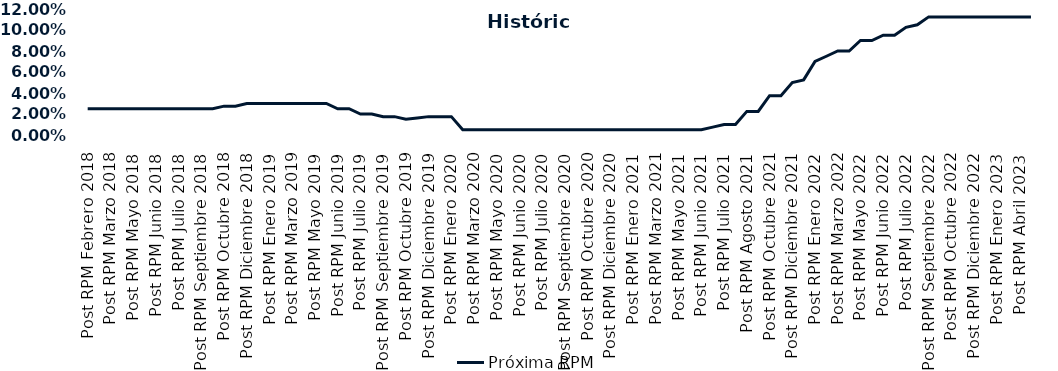
| Category | Próxima RPM |
|---|---|
| Post RPM Febrero 2018 | 0.025 |
| Pre RPM Marzo 2018 | 0.025 |
| Post RPM Marzo 2018 | 0.025 |
| Pre RPM Mayo 2018 | 0.025 |
| Post RPM Mayo 2018 | 0.025 |
| Pre RPM Junio 2018 | 0.025 |
| Post RPM Junio 2018 | 0.025 |
| Pre RPM Julio 2018 | 0.025 |
| Post RPM Julio 2018 | 0.025 |
| Pre RPM Septiembre 2018 | 0.025 |
| Post RPM Septiembre 2018 | 0.025 |
| Pre RPM Octubre 2018 | 0.025 |
| Post RPM Octubre 2018 | 0.028 |
| Pre RPM Diciembre 2018 | 0.028 |
| Post RPM Diciembre 2018 | 0.03 |
| Pre RPM Enero 2019 | 0.03 |
| Post RPM Enero 2019 | 0.03 |
| Pre RPM Marzo 2019 | 0.03 |
| Post RPM Marzo 2019 | 0.03 |
| Pre RPM Mayo 2019 | 0.03 |
| Post RPM Mayo 2019 | 0.03 |
| Pre RPM Junio 2019 | 0.03 |
| Post RPM Junio 2019 | 0.025 |
| Pre RPM Julio 2019 | 0.025 |
| Post RPM Julio 2019 | 0.02 |
| Pre RPM Septiembre 2019 | 0.02 |
| Post RPM Septiembre 2019 | 0.018 |
| Pre RPM Octubre 2019 | 0.018 |
| Post RPM Octubre 2019 | 0.015 |
| Pre RPM Diciembre 2019 | 0.016 |
| Post RPM Diciembre 2019 | 0.018 |
| Pre RPM Enero 2020 | 0.018 |
| Post RPM Enero 2020 | 0.018 |
| Pre RPM Marzo 2020 | 0.005 |
| Post RPM Marzo 2020 | 0.005 |
| Pre RPM Mayo 2020 | 0.005 |
| Post RPM Mayo 2020 | 0.005 |
| Pre RPM Junio 2020 | 0.005 |
| Post RPM Junio 2020 | 0.005 |
| Pre RPM Julio 2020 | 0.005 |
| Post RPM Julio 2020 | 0.005 |
| Pre RPM Septiembre 2020 | 0.005 |
| Post RPM Septiembre 2020 | 0.005 |
| Pre RPM Octubre 2020 | 0.005 |
| Post RPM Octubre 2020 | 0.005 |
| Pre RPM Diciembre 2020 | 0.005 |
| Post RPM Diciembre 2020 | 0.005 |
| Pre RPM Enero 2021 | 0.005 |
| Post RPM Enero 2021 | 0.005 |
| Pre RPM Marzo 2021 | 0.005 |
| Post RPM Marzo 2021 | 0.005 |
| Pre RPM Mayo 2021 | 0.005 |
| Post RPM Mayo 2021 | 0.005 |
| Pre RPM Junio 2021 | 0.005 |
| Post RPM Junio 2021 | 0.005 |
| Pre RPM Julio 2021 | 0.008 |
| Post RPM Julio 2021 | 0.01 |
| Pre RPM Agosto 2021 | 0.01 |
| Post RPM Agosto 2021 | 0.022 |
| Pre RPM Octubre 2021 | 0.022 |
| Post RPM Octubre 2021 | 0.038 |
| Pre RPM Diciembre 2021 | 0.038 |
| Post RPM Diciembre 2021 | 0.05 |
| Pre RPM Enero 2022 | 0.052 |
| Post RPM Enero 2022 | 0.07 |
| Pre RPM Marzo 2022 | 0.075 |
| Post RPM Marzo 2022 | 0.08 |
| Pre RPM Mayo 2022 | 0.08 |
| Post RPM Mayo 2022 | 0.09 |
| Pre RPM Junio 2022 | 0.09 |
| Post RPM Junio 2022 | 0.095 |
| Pre RPM Julio 2022 | 0.095 |
| Post RPM Julio 2022 | 0.102 |
| Pre RPM Septiembre 2022 | 0.105 |
| Post RPM Septiembre 2022 | 0.112 |
| Pre RPM Octubre 2022 | 0.112 |
| Post RPM Octubre 2022 | 0.112 |
| Pre RPM Diciembre 2022 | 0.112 |
| Post RPM Diciembre 2022 | 0.112 |
| Pre RPM Enero 2023 | 0.112 |
| Post RPM Enero 2023 | 0.112 |
| Pre RPM Abril 2023 | 0.112 |
| Post RPM Abril 2023 | 0.112 |
| Pre RPM Mayo 2023 | 0.112 |